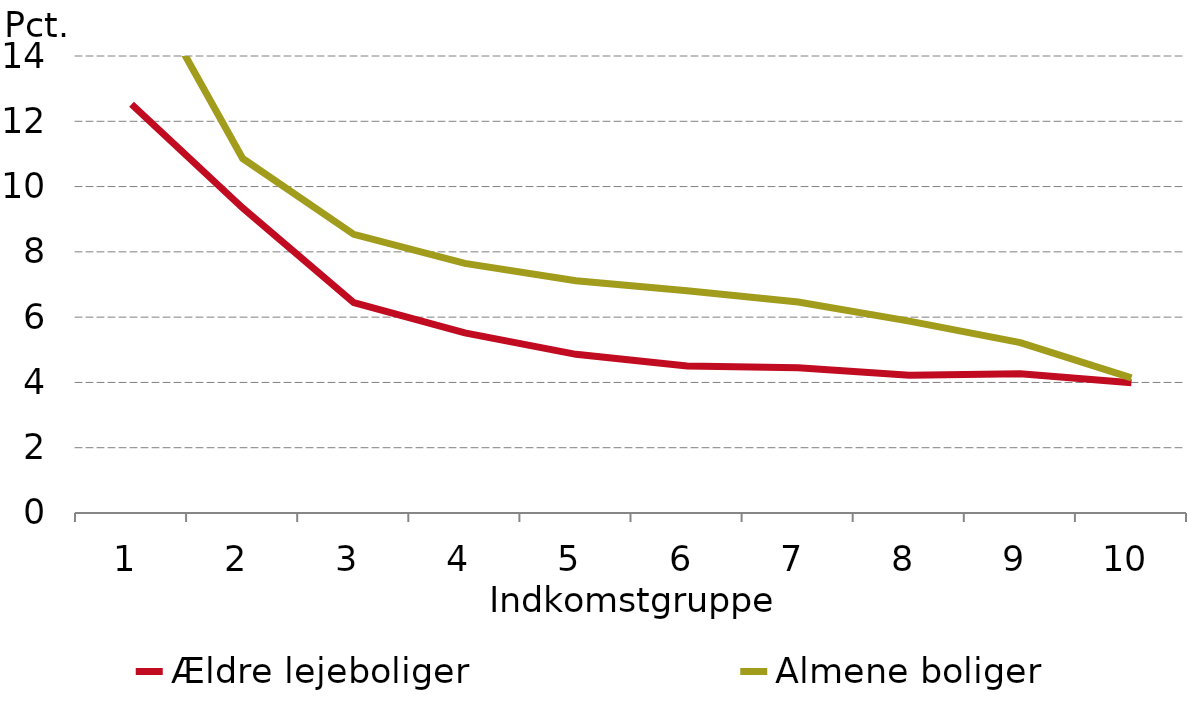
| Category |  Ældre lejeboliger |
|---|---|
| 0 | 12.52 |
| 1 | 9.344 |
| 2 | 6.444 |
| 3 | 5.517 |
| 4 | 4.861 |
| 5 | 4.505 |
| 6 | 4.448 |
| 7 | 4.218 |
| 8 | 4.263 |
| 9 | 3.993 |